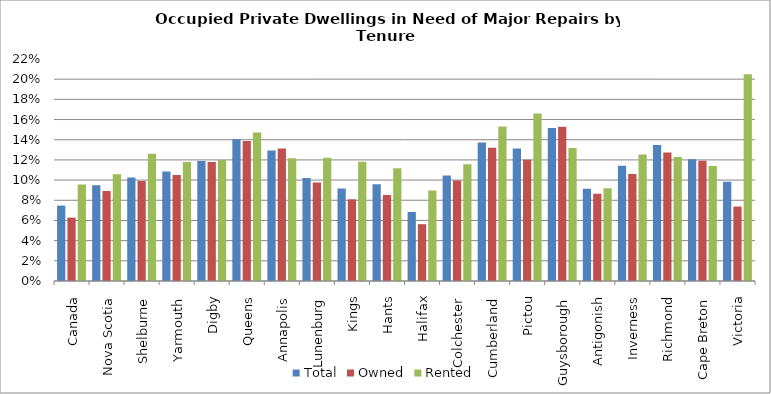
| Category | Total | Owned | Rented |
|---|---|---|---|
| Canada | 0.075 | 0.063 | 0.096 |
| Nova Scotia | 0.095 | 0.089 | 0.106 |
| Shelburne | 0.103 | 0.099 | 0.126 |
| Yarmouth | 0.108 | 0.105 | 0.118 |
| Digby | 0.119 | 0.118 | 0.12 |
| Queens | 0.14 | 0.139 | 0.147 |
| Annapolis | 0.129 | 0.131 | 0.122 |
| Lunenburg | 0.102 | 0.098 | 0.122 |
| Kings | 0.092 | 0.081 | 0.118 |
| Hants | 0.096 | 0.085 | 0.112 |
| Halifax | 0.068 | 0.056 | 0.09 |
| Colchester | 0.105 | 0.1 | 0.116 |
| Cumberland | 0.137 | 0.132 | 0.153 |
| Pictou | 0.131 | 0.12 | 0.166 |
| Guysborough | 0.152 | 0.153 | 0.132 |
| Antigonish | 0.091 | 0.086 | 0.092 |
| Inverness | 0.114 | 0.106 | 0.125 |
| Richmond | 0.135 | 0.127 | 0.123 |
| Cape Breton | 0.121 | 0.119 | 0.114 |
| Victoria | 0.098 | 0.074 | 0.205 |